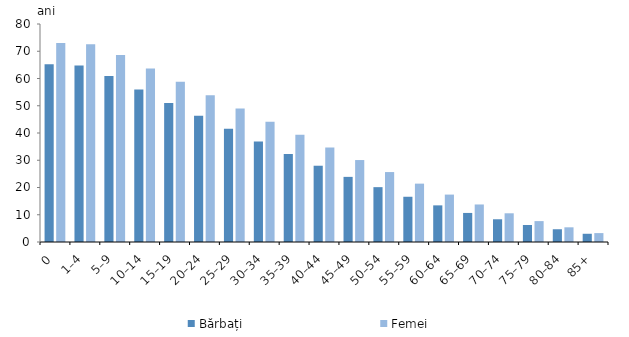
| Category | Bărbați | Femei |
|---|---|---|
| 0 | 65.219 | 72.988 |
| 1–4 | 64.803 | 72.575 |
| 5–9 | 60.893 | 68.654 |
| 10–14 | 55.958 | 63.703 |
| 15–19 | 51.034 | 58.787 |
| 20–24 | 46.3 | 53.885 |
| 25–29 | 41.572 | 48.984 |
| 30–34 | 36.871 | 44.146 |
| 35–39 | 32.305 | 39.386 |
| 40–44 | 27.989 | 34.669 |
| 45–49 | 23.9 | 30.078 |
| 50–54 | 20.128 | 25.668 |
| 55–59 | 16.602 | 21.419 |
| 60–64 | 13.445 | 17.4 |
| 65–69 | 10.664 | 13.773 |
| 70–74 | 8.342 | 10.538 |
| 75–79 | 6.233 | 7.669 |
| 80–84 | 4.68 | 5.39 |
| 85+ | 3.02 | 3.268 |